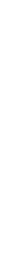
| Category | 16 maja  2018 r.
16 May  2018 |
|---|---|
| 0.0 | 16658.5 |
| 1.0 | 16031.1 |
| 2.0 | 15816.9 |
| 3.0 | 15848.4 |
| 4.0 | 15870.7 |
| 5.0 | 15694.6 |
| 6.0 | 16275.3 |
| 7.0 | 19152.7 |
| 8.0 | 20667.4 |
| 9.0 | 21275 |
| 10.0 | 21264.9 |
| 11.0 | 21695.5 |
| 12.0 | 21881.8 |
| 13.0 | 21916 |
| 14.0 | 21314.2 |
| 15.0 | 21577.6 |
| 16.0 | 21216 |
| 17.0 | 21006.5 |
| 18.0 | 20468.8 |
| 19.0 | 20960.5 |
| 20.0 | 21086.8 |
| 21.0 | 21381.4 |
| 22.0 | 19358.6 |
| 23.0 | 18234.1 |
| 24.0 | 16816 |